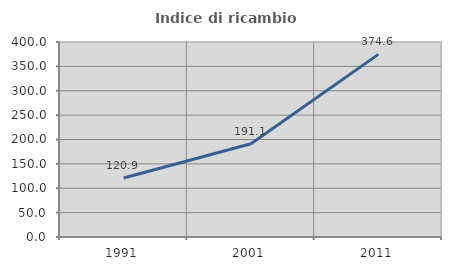
| Category | Indice di ricambio occupazionale  |
|---|---|
| 1991.0 | 120.909 |
| 2001.0 | 191.139 |
| 2011.0 | 374.627 |